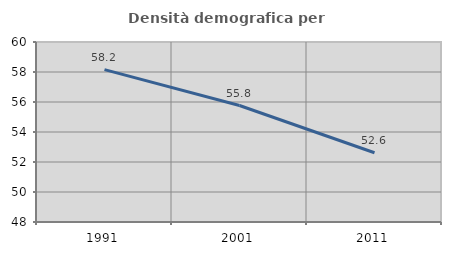
| Category | Densità demografica |
|---|---|
| 1991.0 | 58.156 |
| 2001.0 | 55.764 |
| 2011.0 | 52.617 |